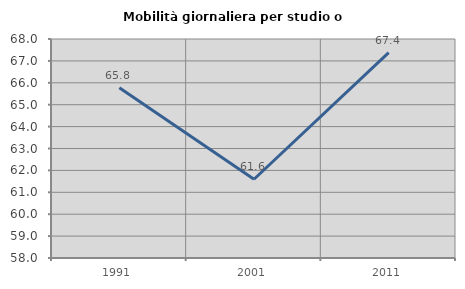
| Category | Mobilità giornaliera per studio o lavoro |
|---|---|
| 1991.0 | 65.778 |
| 2001.0 | 61.597 |
| 2011.0 | 67.379 |